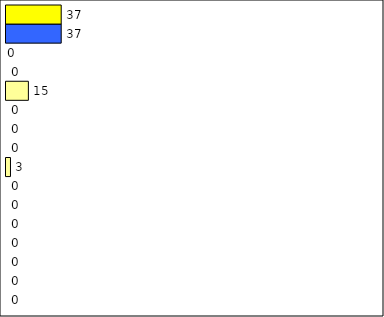
| Category | -2 | -1 | 0 | 1 | 2 | 3 | 4 | 5 | 6 | 7 | 8 | 9 | 10 | 11 | 12 | Perfect Round |
|---|---|---|---|---|---|---|---|---|---|---|---|---|---|---|---|---|
| 0 | 0 | 0 | 0 | 0 | 0 | 0 | 0 | 3 | 0 | 0 | 0 | 15 | 0 | 0 | 37 | 37 |